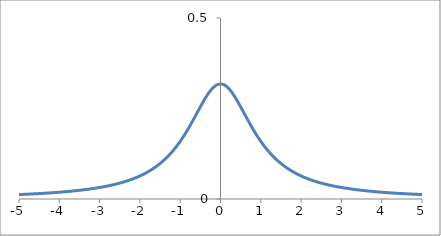
| Category | Series 0 |
|---|---|
| -5.0 | 0.012 |
| -4.9 | 0.013 |
| -4.8 | 0.013 |
| -4.7 | 0.014 |
| -4.6 | 0.014 |
| -4.5 | 0.015 |
| -4.4 | 0.016 |
| -4.3 | 0.016 |
| -4.2 | 0.017 |
| -4.1 | 0.018 |
| -4.0 | 0.019 |
| -3.9 | 0.02 |
| -3.8 | 0.021 |
| -3.7 | 0.022 |
| -3.6 | 0.023 |
| -3.50000000000001 | 0.024 |
| -3.40000000000001 | 0.025 |
| -3.30000000000001 | 0.027 |
| -3.20000000000001 | 0.028 |
| -3.10000000000001 | 0.03 |
| -3.00000000000001 | 0.032 |
| -2.90000000000001 | 0.034 |
| -2.80000000000001 | 0.036 |
| -2.70000000000001 | 0.038 |
| -2.60000000000001 | 0.041 |
| -2.50000000000001 | 0.044 |
| -2.40000000000001 | 0.047 |
| -2.30000000000001 | 0.051 |
| -2.20000000000001 | 0.055 |
| -2.10000000000001 | 0.059 |
| -2.00000000000001 | 0.064 |
| -1.90000000000001 | 0.069 |
| -1.80000000000001 | 0.075 |
| -1.70000000000001 | 0.082 |
| -1.60000000000001 | 0.089 |
| -1.50000000000001 | 0.098 |
| -1.40000000000001 | 0.108 |
| -1.30000000000001 | 0.118 |
| -1.20000000000001 | 0.13 |
| -1.10000000000001 | 0.144 |
| -1.00000000000001 | 0.159 |
| -0.90000000000001 | 0.176 |
| -0.80000000000001 | 0.194 |
| -0.70000000000002 | 0.214 |
| -0.60000000000002 | 0.234 |
| -0.50000000000002 | 0.255 |
| -0.40000000000002 | 0.274 |
| -0.30000000000002 | 0.292 |
| -0.20000000000002 | 0.306 |
| -0.10000000000002 | 0.315 |
| -2.04281036531029e-14 | 0.318 |
| 0.0999999999999801 | 0.315 |
| 0.19999999999998 | 0.306 |
| 0.29999999999998 | 0.292 |
| 0.39999999999998 | 0.274 |
| 0.49999999999998 | 0.255 |
| 0.59999999999998 | 0.234 |
| 0.69999999999998 | 0.214 |
| 0.79999999999998 | 0.194 |
| 0.89999999999998 | 0.176 |
| 0.99999999999998 | 0.159 |
| 1.09999999999998 | 0.144 |
| 1.19999999999998 | 0.13 |
| 1.29999999999998 | 0.118 |
| 1.39999999999998 | 0.108 |
| 1.49999999999998 | 0.098 |
| 1.59999999999998 | 0.089 |
| 1.69999999999998 | 0.082 |
| 1.79999999999998 | 0.075 |
| 1.89999999999998 | 0.069 |
| 1.99999999999998 | 0.064 |
| 2.09999999999997 | 0.059 |
| 2.19999999999997 | 0.055 |
| 2.29999999999997 | 0.051 |
| 2.39999999999997 | 0.047 |
| 2.49999999999997 | 0.044 |
| 2.59999999999997 | 0.041 |
| 2.69999999999997 | 0.038 |
| 2.79999999999997 | 0.036 |
| 2.89999999999997 | 0.034 |
| 2.99999999999997 | 0.032 |
| 3.09999999999997 | 0.03 |
| 3.19999999999997 | 0.028 |
| 3.29999999999997 | 0.027 |
| 3.39999999999997 | 0.025 |
| 3.49999999999997 | 0.024 |
| 3.59999999999997 | 0.023 |
| 3.69999999999997 | 0.022 |
| 3.79999999999997 | 0.021 |
| 3.89999999999997 | 0.02 |
| 3.99999999999997 | 0.019 |
| 4.09999999999997 | 0.018 |
| 4.19999999999997 | 0.017 |
| 4.29999999999997 | 0.016 |
| 4.39999999999997 | 0.016 |
| 4.49999999999997 | 0.015 |
| 4.59999999999997 | 0.014 |
| 4.69999999999997 | 0.014 |
| 4.79999999999997 | 0.013 |
| 4.89999999999996 | 0.013 |
| 4.99999999999996 | 0.012 |